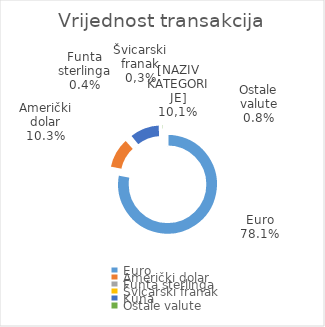
| Category | Vrijednost transakcija |
|---|---|
| Euro | 200724506781 |
| Američki dolar | 26548460468 |
| Funta sterlinga | 1009221929 |
| Švicarski franak | 623187290 |
| Kuna | 26036543402 |
| Ostale valute | 1984358669 |